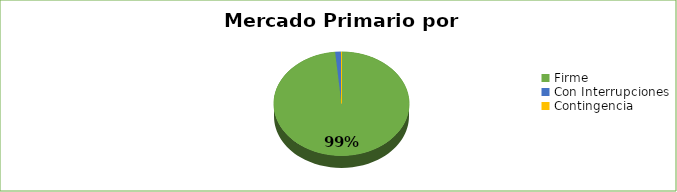
| Category | Series 0 |
|---|---|
| Firme | 6429161 |
| Con Interrupciones | 88185 |
| Contingencia | 9000 |